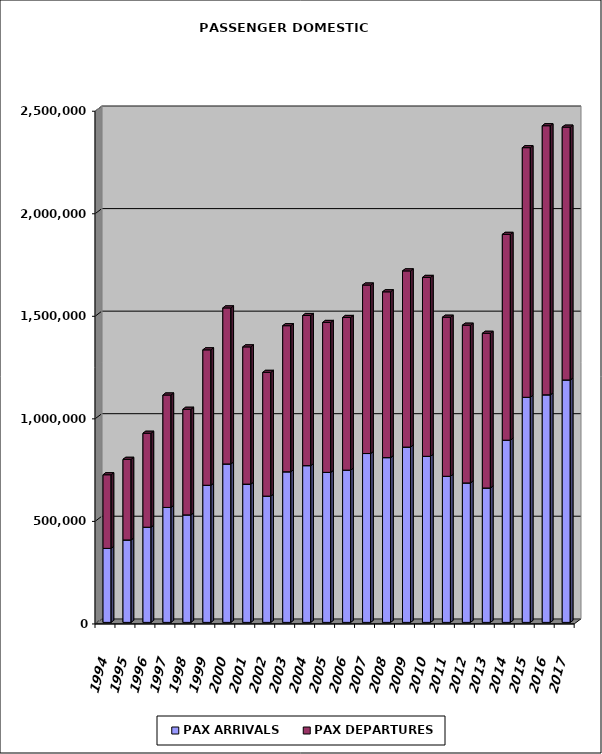
| Category | PAX ARRIVALS | PAX DEPARTURES |
|---|---|---|
| 1994.0 | 360883 | 358963 |
| 1995.0 | 401962 | 393123 |
| 1996.0 | 464067 | 458123 |
| 1997.0 | 560568 | 548168 |
| 1998.0 | 524232 | 514917 |
| 1999.0 | 668697 | 660279 |
| 2000.0 | 772548 | 760835 |
| 2001.0 | 674213 | 669153 |
| 2002.0 | 615650 | 603413 |
| 2003.0 | 734298 | 712379 |
| 2004.0 | 764369 | 732042 |
| 2005.0 | 731537 | 730968 |
| 2006.0 | 742424 | 744409 |
| 2007.0 | 823410 | 821540 |
| 2008.0 | 803444 | 808439 |
| 2009.0 | 854827 | 859063 |
| 2010.0 | 809869 | 872202 |
| 2011.0 | 712390 | 775582 |
| 2012.0 | 679977 | 769139 |
| 2013.0 | 655359 | 754249 |
| 2014.0 | 888459 | 1003559 |
| 2015.0 | 1097676 | 1217097 |
| 2016.0 | 1109598 | 1312124 |
| 2017.0 | 1182135 | 1232664 |